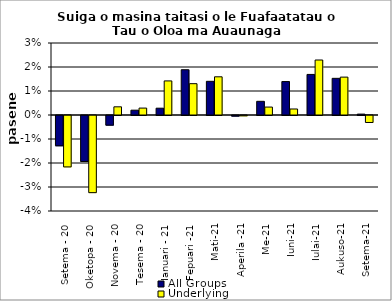
| Category | All Groups | Underlying |
|---|---|---|
| Setema - 20 | -0.013 | -0.021 |
| Oketopa - 20 | -0.019 | -0.032 |
| Novema - 20 | -0.004 | 0.003 |
| Tesema - 20 | 0.002 | 0.003 |
| Ianuari - 21 | 0.003 | 0.014 |
| Fepuari -21 | 0.019 | 0.013 |
| Mati-21 | 0.014 | 0.016 |
| Aperila -21 | 0 | 0 |
| Me-21 | 0.006 | 0.003 |
| Iuni-21 | 0.014 | 0.003 |
| Iulai-21 | 0.017 | 0.023 |
| Aukuso-21 | 0.015 | 0.016 |
| Setema-21 | 0 | -0.003 |